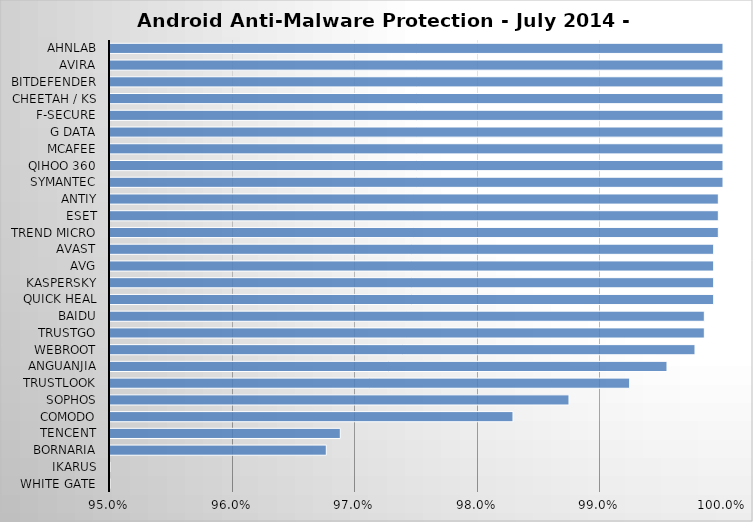
| Category | Series 0 |
|---|---|
| White Gate | 0.693 |
| Ikarus | 0.941 |
| Bornaria | 0.968 |
| Tencent | 0.969 |
| Comodo | 0.983 |
| Sophos | 0.987 |
| Trustlook | 0.992 |
| Anguanjia | 0.995 |
| Webroot | 0.998 |
| TrustGo | 0.998 |
| Baidu | 0.998 |
| Quick Heal | 0.999 |
| Kaspersky | 0.999 |
| AVG | 0.999 |
| Avast | 0.999 |
| Trend Micro | 1 |
| ESET | 1 |
| Antiy | 1 |
| Symantec | 1 |
| Qihoo 360 | 1 |
| McAfee | 1 |
| G Data | 1 |
| F-Secure | 1 |
| Cheetah / KS | 1 |
| Bitdefender | 1 |
| Avira | 1 |
| AhnLab | 1 |